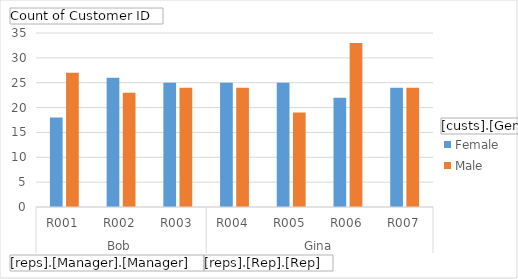
| Category | Female | Male |
|---|---|---|
| 0 | 18 | 27 |
| 1 | 26 | 23 |
| 2 | 25 | 24 |
| 3 | 25 | 24 |
| 4 | 25 | 19 |
| 5 | 22 | 33 |
| 6 | 24 | 24 |